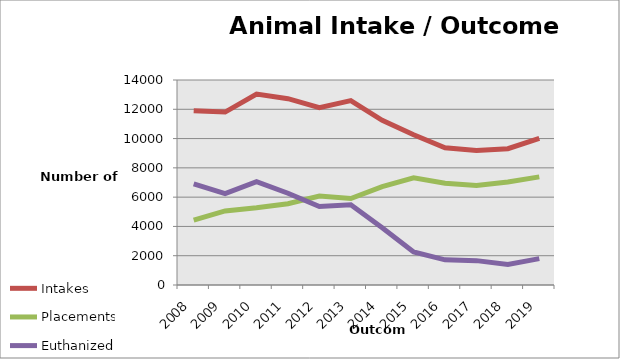
| Category | Intakes | Placements | Euthanized |
|---|---|---|---|
| 2008.0 | 11908 | 4424 | 6909 |
| 2009.0 | 11811 | 5059 | 6245 |
| 2010.0 | 13044 | 5273 | 7065 |
| 2011.0 | 12725 | 5552 | 6269 |
| 2012.0 | 12114 | 6070 | 5359 |
| 2013.0 | 12589 | 5907 | 5475 |
| 2014.0 | 11249 | 6714 | 3913 |
| 2015.0 | 10258 | 7317 | 2262 |
| 2016.0 | 9369 | 6950 | 1721 |
| 2017.0 | 9191 | 6791 | 1664 |
| 2018.0 | 9307 | 7039 | 1395 |
| 2019.0 | 10012 | 7384 | 1802 |